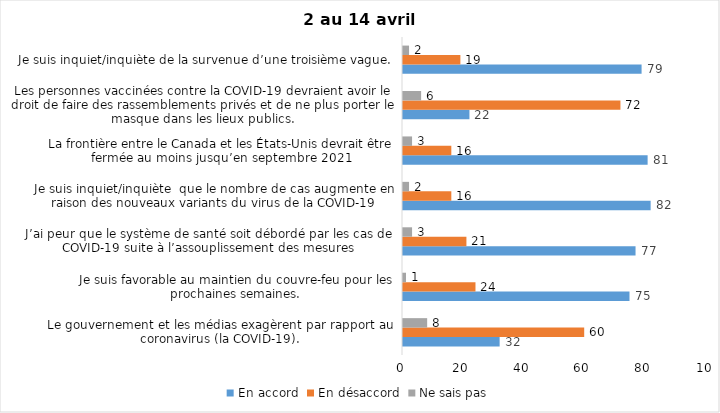
| Category | En accord | En désaccord | Ne sais pas |
|---|---|---|---|
| Le gouvernement et les médias exagèrent par rapport au coronavirus (la COVID-19). | 32 | 60 | 8 |
| Je suis favorable au maintien du couvre-feu pour les prochaines semaines. | 75 | 24 | 1 |
| J’ai peur que le système de santé soit débordé par les cas de COVID-19 suite à l’assouplissement des mesures | 77 | 21 | 3 |
| Je suis inquiet/inquiète  que le nombre de cas augmente en raison des nouveaux variants du virus de la COVID-19 | 82 | 16 | 2 |
| La frontière entre le Canada et les États-Unis devrait être fermée au moins jusqu’en septembre 2021 | 81 | 16 | 3 |
| Les personnes vaccinées contre la COVID-19 devraient avoir le droit de faire des rassemblements privés et de ne plus porter le masque dans les lieux publics. | 22 | 72 | 6 |
| Je suis inquiet/inquiète de la survenue d’une troisième vague. | 79 | 19 | 2 |